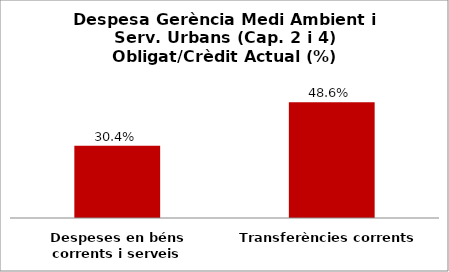
| Category | Series 0 |
|---|---|
| Despeses en béns corrents i serveis | 0.304 |
| Transferències corrents | 0.486 |